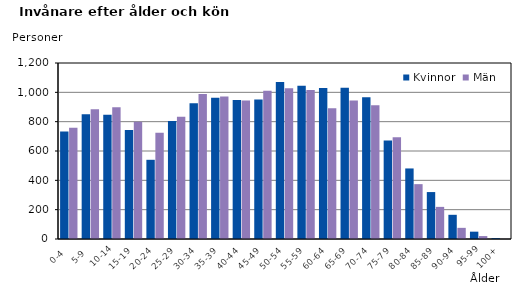
| Category | Kvinnor | Män |
|---|---|---|
|   0-4  | 733 | 759 |
|   5-9  | 851 | 885 |
| 10-14 | 848 | 898 |
| 15-19  | 743 | 800 |
| 20-24  | 540 | 724 |
| 25-29  | 804 | 834 |
| 30-34  | 925 | 988 |
| 35-39  | 963 | 972 |
| 40-44  | 947 | 944 |
| 45-49  | 951 | 1011 |
| 50-54  | 1070 | 1027 |
| 55-59  | 1045 | 1016 |
| 60-64  | 1029 | 891 |
| 65-69  | 1032 | 944 |
| 70-74  | 966 | 912 |
| 75-79  | 671 | 694 |
| 80-84  | 481 | 374 |
| 85-89  | 320 | 219 |
| 90-94  | 165 | 76 |
| 95-99 | 50 | 20 |
| 100+ | 6 | 1 |